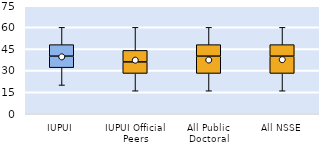
| Category | 25th | 50th | 75th |
|---|---|---|---|
| IUPUI | 32 | 8 | 8 |
| IUPUI Official Peers | 28 | 8 | 8 |
| All Public Doctoral | 28 | 12 | 8 |
| All NSSE | 28 | 12 | 8 |